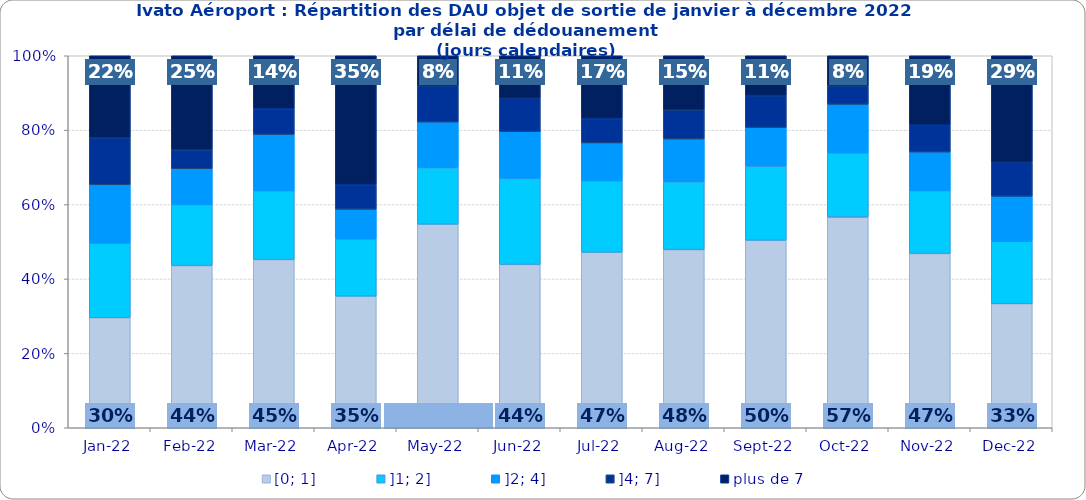
| Category | [0; 1] | ]1; 2] | ]2; 4] | ]4; 7] | plus de 7 |
|---|---|---|---|---|---|
| 2022-01-01 | 0.296 | 0.201 | 0.157 | 0.127 | 0.22 |
| 2022-02-01 | 0.436 | 0.164 | 0.096 | 0.051 | 0.253 |
| 2022-03-01 | 0.452 | 0.185 | 0.151 | 0.069 | 0.143 |
| 2022-04-01 | 0.354 | 0.154 | 0.08 | 0.066 | 0.346 |
| 2022-05-01 | 0.547 | 0.152 | 0.122 | 0.098 | 0.08 |
| 2022-06-01 | 0.439 | 0.232 | 0.125 | 0.09 | 0.114 |
| 2022-07-01 | 0.472 | 0.192 | 0.102 | 0.066 | 0.169 |
| 2022-08-01 | 0.479 | 0.183 | 0.115 | 0.078 | 0.146 |
| 2022-09-01 | 0.504 | 0.199 | 0.104 | 0.086 | 0.107 |
| 2022-10-01 | 0.566 | 0.173 | 0.131 | 0.05 | 0.081 |
| 2022-11-01 | 0.468 | 0.169 | 0.104 | 0.072 | 0.187 |
| 2022-12-01 | 0.333 | 0.168 | 0.121 | 0.091 | 0.287 |